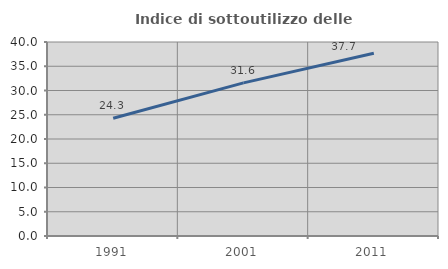
| Category | Indice di sottoutilizzo delle abitazioni  |
|---|---|
| 1991.0 | 24.279 |
| 2001.0 | 31.567 |
| 2011.0 | 37.697 |